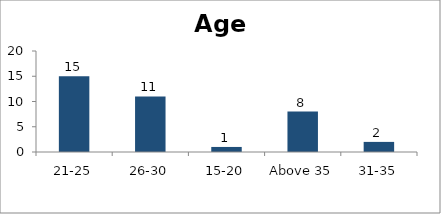
| Category | Age |
|---|---|
| 21-25 | 15 |
| 26-30 | 11 |
| 15-20 | 1 |
| Above 35 | 8 |
| 31-35 | 2 |